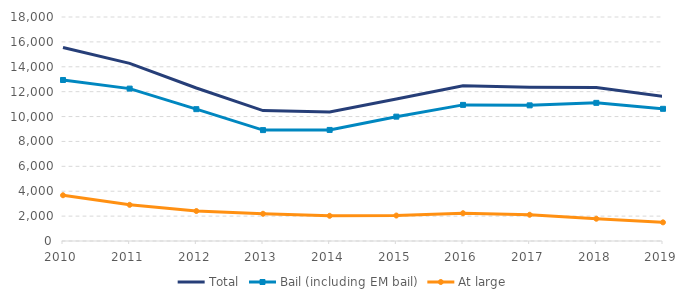
| Category | Total | Bail (including EM bail) | At large |
|---|---|---|---|
| 2010.0 | 15550 | 12938 | 3676 |
| 2011.0 | 14278 | 12245 | 2905 |
| 2012.0 | 12295 | 10594 | 2408 |
| 2013.0 | 10482 | 8911 | 2188 |
| 2014.0 | 10364 | 8925 | 2025 |
| 2015.0 | 11409 | 9992 | 2046 |
| 2016.0 | 12473 | 10938 | 2232 |
| 2017.0 | 12358 | 10900 | 2108 |
| 2018.0 | 12329 | 11101 | 1789 |
| 2019.0 | 11629 | 10621 | 1498 |